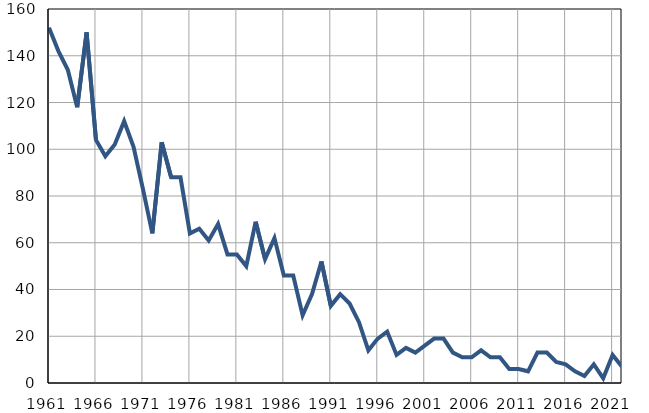
| Category | Умрла 
одојчад |
|---|---|
| 1961.0 | 152 |
| 1962.0 | 142 |
| 1963.0 | 134 |
| 1964.0 | 118 |
| 1965.0 | 150 |
| 1966.0 | 104 |
| 1967.0 | 97 |
| 1968.0 | 102 |
| 1969.0 | 112 |
| 1970.0 | 101 |
| 1971.0 | 83 |
| 1972.0 | 64 |
| 1973.0 | 103 |
| 1974.0 | 88 |
| 1975.0 | 88 |
| 1976.0 | 64 |
| 1977.0 | 66 |
| 1978.0 | 61 |
| 1979.0 | 68 |
| 1980.0 | 55 |
| 1981.0 | 55 |
| 1982.0 | 50 |
| 1983.0 | 69 |
| 1984.0 | 53 |
| 1985.0 | 62 |
| 1986.0 | 46 |
| 1987.0 | 46 |
| 1988.0 | 29 |
| 1989.0 | 38 |
| 1990.0 | 52 |
| 1991.0 | 33 |
| 1992.0 | 38 |
| 1993.0 | 34 |
| 1994.0 | 26 |
| 1995.0 | 14 |
| 1996.0 | 19 |
| 1997.0 | 22 |
| 1998.0 | 12 |
| 1999.0 | 15 |
| 2000.0 | 13 |
| 2001.0 | 16 |
| 2002.0 | 19 |
| 2003.0 | 19 |
| 2004.0 | 13 |
| 2005.0 | 11 |
| 2006.0 | 11 |
| 2007.0 | 14 |
| 2008.0 | 11 |
| 2009.0 | 11 |
| 2010.0 | 6 |
| 2011.0 | 6 |
| 2012.0 | 5 |
| 2013.0 | 13 |
| 2014.0 | 13 |
| 2015.0 | 9 |
| 2016.0 | 8 |
| 2017.0 | 5 |
| 2018.0 | 3 |
| 2019.0 | 8 |
| 2020.0 | 2 |
| 2021.0 | 12 |
| 2022.0 | 7 |